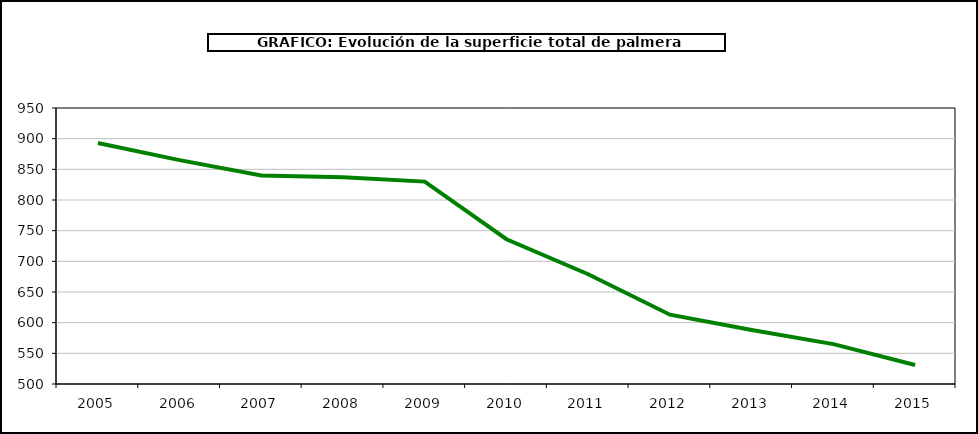
| Category | superficie kiwi |
|---|---|
| 2005.0 | 893 |
| 2006.0 | 865 |
| 2007.0 | 840 |
| 2008.0 | 837 |
| 2009.0 | 830 |
| 2010.0 | 736 |
| 2011.0 | 679 |
| 2012.0 | 613 |
| 2013.0 | 588 |
| 2014.0 | 565 |
| 2015.0 | 531 |